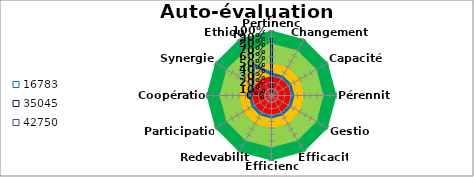
| Category | Series 0 | Series 1 | Series 2 | Series 3 | Series 4 | 16783 | 35045 | 42750 |
|---|---|---|---|---|---|---|---|---|
| 0 | 1 | 0.8 | 0.5 | 0.3 | 0 | 0.33 | 0.887 | 0 |
| 1 | 1 | 0.8 | 0.5 | 0.3 | 0 | 0.33 | 0 | 0 |
| 2 | 1 | 0.8 | 0.5 | 0.3 | 0 | 0.33 | 0 | 0 |
| 3 | 1 | 0.8 | 0.5 | 0.3 | 0 | 0.33 | 0 | 0 |
| 4 | 1 | 0.8 | 0.5 | 0.3 | 0 | 0.33 | 0 | 0 |
| 5 | 1 | 0.8 | 0.5 | 0.3 | 0 | 0.33 | 0 | 0 |
| 6 | 1 | 0.8 | 0.5 | 0.3 | 0 | 0.33 | 0 | 0 |
| 7 | 1 | 0.8 | 0.5 | 0.3 | 0 | 0.33 | 0 | 0 |
| 8 | 1 | 0.8 | 0.5 | 0.3 | 0 | 0.33 | 0 | 0 |
| 9 | 1 | 0.8 | 0.5 | 0.3 | 0 | 0.33 | 0 | 0 |
| 10 | 1 | 0.8 | 0.5 | 0.3 | 0 | 0.33 | 0 | 0 |
| 11 | 1 | 0.8 | 0.5 | 0.3 | 0 | 0.553 | 0 | 0 |